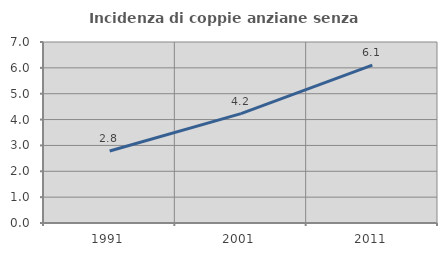
| Category | Incidenza di coppie anziane senza figli  |
|---|---|
| 1991.0 | 2.783 |
| 2001.0 | 4.232 |
| 2011.0 | 6.109 |